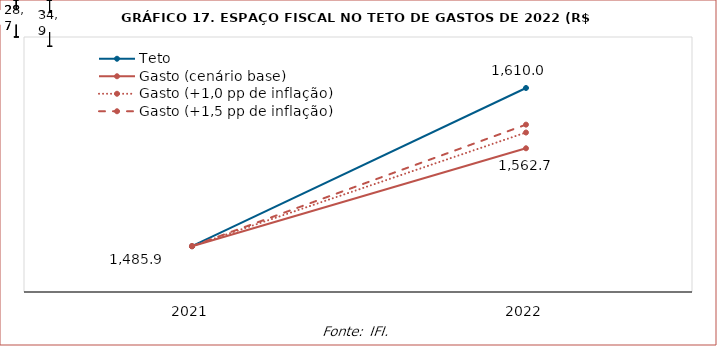
| Category | Teto | Gasto (cenário base) | Gasto (+1,0 pp de inflação) | Gasto (+1,5 pp de inflação) |
|---|---|---|---|---|
| 2021.0 | 1485.936 | 1485.936 | 1485.936 | 1485.936 |
| 2022.0 | 1610.012 | 1562.721 | 1575.086 | 1581.268 |